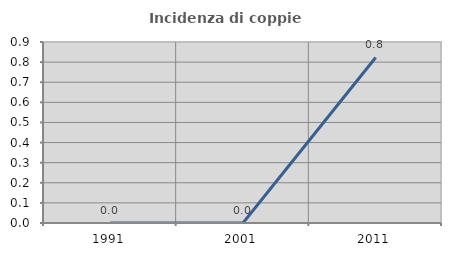
| Category | Incidenza di coppie miste |
|---|---|
| 1991.0 | 0 |
| 2001.0 | 0 |
| 2011.0 | 0.823 |